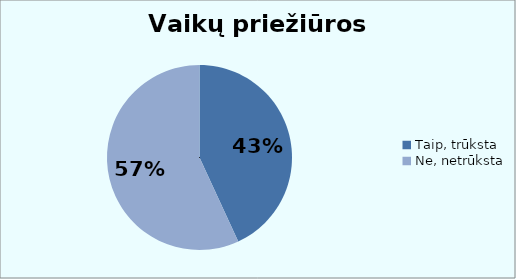
| Category | Series 0 |
|---|---|
| Taip, trūksta | 47 |
| Ne, netrūksta | 62 |